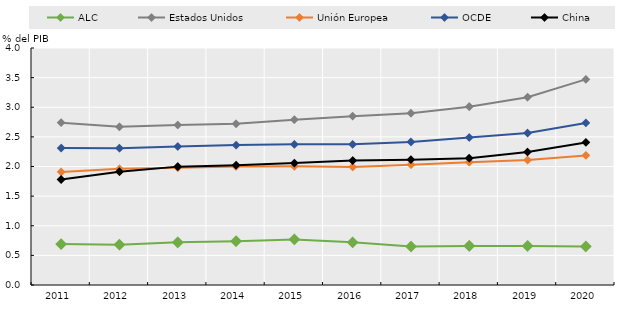
| Category | ALC | Estados Unidos | Unión Europea | OCDE | China |
|---|---|---|---|---|---|
| 2011.0 | 0.69 | 2.74 | 1.908 | 2.312 | 1.78 |
| 2012.0 | 0.68 | 2.67 | 1.962 | 2.309 | 1.912 |
| 2013.0 | 0.72 | 2.7 | 1.977 | 2.336 | 1.998 |
| 2014.0 | 0.74 | 2.72 | 2.001 | 2.361 | 2.022 |
| 2015.0 | 0.77 | 2.79 | 2.004 | 2.374 | 2.057 |
| 2016.0 | 0.72 | 2.85 | 1.992 | 2.374 | 2.1 |
| 2017.0 | 0.65 | 2.9 | 2.03 | 2.414 | 2.116 |
| 2018.0 | 0.66 | 3.01 | 2.074 | 2.491 | 2.141 |
| 2019.0 | 0.66 | 3.17 | 2.109 | 2.564 | 2.245 |
| 2020.0 | 0.65 | 3.47 | 2.187 | 2.736 | 2.407 |